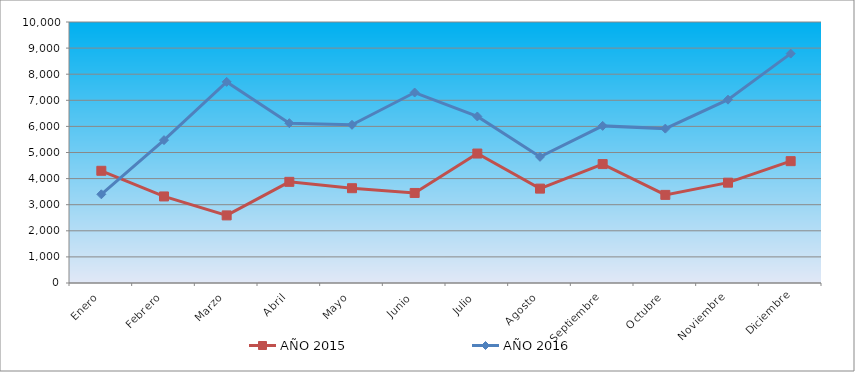
| Category | AÑO 2015 | AÑO 2016 |
|---|---|---|
| Enero | 4299 | 3398 |
| Febrero | 3316 | 5474 |
| Marzo | 2590 | 7706 |
| Abril | 3876 | 6124 |
| Mayo | 3632 | 6061 |
| Junio | 3450 | 7298 |
| Julio | 4960 | 6381 |
| Agosto | 3616 | 4834 |
| Septiembre | 4556 | 6020 |
| Octubre | 3376 | 5915 |
| Noviembre | 3844 | 7025 |
| Diciembre | 4668 | 8789 |